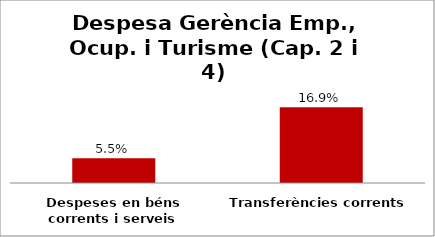
| Category | Series 0 |
|---|---|
| Despeses en béns corrents i serveis | 0.055 |
| Transferències corrents | 0.169 |